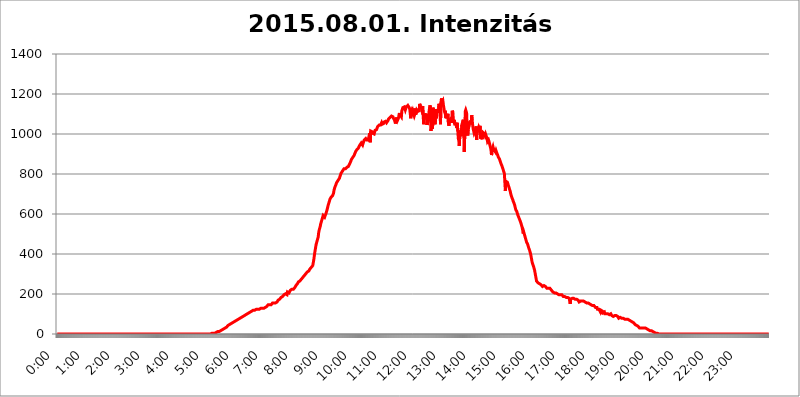
| Category | 2015.08.01. Intenzitás [W/m^2] |
|---|---|
| 0.0 | 0 |
| 0.0006944444444444445 | 0 |
| 0.001388888888888889 | 0 |
| 0.0020833333333333333 | 0 |
| 0.002777777777777778 | 0 |
| 0.003472222222222222 | 0 |
| 0.004166666666666667 | 0 |
| 0.004861111111111111 | 0 |
| 0.005555555555555556 | 0 |
| 0.0062499999999999995 | 0 |
| 0.006944444444444444 | 0 |
| 0.007638888888888889 | 0 |
| 0.008333333333333333 | 0 |
| 0.009027777777777779 | 0 |
| 0.009722222222222222 | 0 |
| 0.010416666666666666 | 0 |
| 0.011111111111111112 | 0 |
| 0.011805555555555555 | 0 |
| 0.012499999999999999 | 0 |
| 0.013194444444444444 | 0 |
| 0.013888888888888888 | 0 |
| 0.014583333333333332 | 0 |
| 0.015277777777777777 | 0 |
| 0.015972222222222224 | 0 |
| 0.016666666666666666 | 0 |
| 0.017361111111111112 | 0 |
| 0.018055555555555557 | 0 |
| 0.01875 | 0 |
| 0.019444444444444445 | 0 |
| 0.02013888888888889 | 0 |
| 0.020833333333333332 | 0 |
| 0.02152777777777778 | 0 |
| 0.022222222222222223 | 0 |
| 0.02291666666666667 | 0 |
| 0.02361111111111111 | 0 |
| 0.024305555555555556 | 0 |
| 0.024999999999999998 | 0 |
| 0.025694444444444447 | 0 |
| 0.02638888888888889 | 0 |
| 0.027083333333333334 | 0 |
| 0.027777777777777776 | 0 |
| 0.02847222222222222 | 0 |
| 0.029166666666666664 | 0 |
| 0.029861111111111113 | 0 |
| 0.030555555555555555 | 0 |
| 0.03125 | 0 |
| 0.03194444444444445 | 0 |
| 0.03263888888888889 | 0 |
| 0.03333333333333333 | 0 |
| 0.034027777777777775 | 0 |
| 0.034722222222222224 | 0 |
| 0.035416666666666666 | 0 |
| 0.036111111111111115 | 0 |
| 0.03680555555555556 | 0 |
| 0.0375 | 0 |
| 0.03819444444444444 | 0 |
| 0.03888888888888889 | 0 |
| 0.03958333333333333 | 0 |
| 0.04027777777777778 | 0 |
| 0.04097222222222222 | 0 |
| 0.041666666666666664 | 0 |
| 0.042361111111111106 | 0 |
| 0.04305555555555556 | 0 |
| 0.043750000000000004 | 0 |
| 0.044444444444444446 | 0 |
| 0.04513888888888889 | 0 |
| 0.04583333333333334 | 0 |
| 0.04652777777777778 | 0 |
| 0.04722222222222222 | 0 |
| 0.04791666666666666 | 0 |
| 0.04861111111111111 | 0 |
| 0.049305555555555554 | 0 |
| 0.049999999999999996 | 0 |
| 0.05069444444444445 | 0 |
| 0.051388888888888894 | 0 |
| 0.052083333333333336 | 0 |
| 0.05277777777777778 | 0 |
| 0.05347222222222222 | 0 |
| 0.05416666666666667 | 0 |
| 0.05486111111111111 | 0 |
| 0.05555555555555555 | 0 |
| 0.05625 | 0 |
| 0.05694444444444444 | 0 |
| 0.057638888888888885 | 0 |
| 0.05833333333333333 | 0 |
| 0.05902777777777778 | 0 |
| 0.059722222222222225 | 0 |
| 0.06041666666666667 | 0 |
| 0.061111111111111116 | 0 |
| 0.06180555555555556 | 0 |
| 0.0625 | 0 |
| 0.06319444444444444 | 0 |
| 0.06388888888888888 | 0 |
| 0.06458333333333334 | 0 |
| 0.06527777777777778 | 0 |
| 0.06597222222222222 | 0 |
| 0.06666666666666667 | 0 |
| 0.06736111111111111 | 0 |
| 0.06805555555555555 | 0 |
| 0.06874999999999999 | 0 |
| 0.06944444444444443 | 0 |
| 0.07013888888888889 | 0 |
| 0.07083333333333333 | 0 |
| 0.07152777777777779 | 0 |
| 0.07222222222222223 | 0 |
| 0.07291666666666667 | 0 |
| 0.07361111111111111 | 0 |
| 0.07430555555555556 | 0 |
| 0.075 | 0 |
| 0.07569444444444444 | 0 |
| 0.0763888888888889 | 0 |
| 0.07708333333333334 | 0 |
| 0.07777777777777778 | 0 |
| 0.07847222222222222 | 0 |
| 0.07916666666666666 | 0 |
| 0.0798611111111111 | 0 |
| 0.08055555555555556 | 0 |
| 0.08125 | 0 |
| 0.08194444444444444 | 0 |
| 0.08263888888888889 | 0 |
| 0.08333333333333333 | 0 |
| 0.08402777777777777 | 0 |
| 0.08472222222222221 | 0 |
| 0.08541666666666665 | 0 |
| 0.08611111111111112 | 0 |
| 0.08680555555555557 | 0 |
| 0.08750000000000001 | 0 |
| 0.08819444444444445 | 0 |
| 0.08888888888888889 | 0 |
| 0.08958333333333333 | 0 |
| 0.09027777777777778 | 0 |
| 0.09097222222222222 | 0 |
| 0.09166666666666667 | 0 |
| 0.09236111111111112 | 0 |
| 0.09305555555555556 | 0 |
| 0.09375 | 0 |
| 0.09444444444444444 | 0 |
| 0.09513888888888888 | 0 |
| 0.09583333333333333 | 0 |
| 0.09652777777777777 | 0 |
| 0.09722222222222222 | 0 |
| 0.09791666666666667 | 0 |
| 0.09861111111111111 | 0 |
| 0.09930555555555555 | 0 |
| 0.09999999999999999 | 0 |
| 0.10069444444444443 | 0 |
| 0.1013888888888889 | 0 |
| 0.10208333333333335 | 0 |
| 0.10277777777777779 | 0 |
| 0.10347222222222223 | 0 |
| 0.10416666666666667 | 0 |
| 0.10486111111111111 | 0 |
| 0.10555555555555556 | 0 |
| 0.10625 | 0 |
| 0.10694444444444444 | 0 |
| 0.1076388888888889 | 0 |
| 0.10833333333333334 | 0 |
| 0.10902777777777778 | 0 |
| 0.10972222222222222 | 0 |
| 0.1111111111111111 | 0 |
| 0.11180555555555556 | 0 |
| 0.11180555555555556 | 0 |
| 0.1125 | 0 |
| 0.11319444444444444 | 0 |
| 0.11388888888888889 | 0 |
| 0.11458333333333333 | 0 |
| 0.11527777777777777 | 0 |
| 0.11597222222222221 | 0 |
| 0.11666666666666665 | 0 |
| 0.1173611111111111 | 0 |
| 0.11805555555555557 | 0 |
| 0.11944444444444445 | 0 |
| 0.12013888888888889 | 0 |
| 0.12083333333333333 | 0 |
| 0.12152777777777778 | 0 |
| 0.12222222222222223 | 0 |
| 0.12291666666666667 | 0 |
| 0.12291666666666667 | 0 |
| 0.12361111111111112 | 0 |
| 0.12430555555555556 | 0 |
| 0.125 | 0 |
| 0.12569444444444444 | 0 |
| 0.12638888888888888 | 0 |
| 0.12708333333333333 | 0 |
| 0.16875 | 0 |
| 0.12847222222222224 | 0 |
| 0.12916666666666668 | 0 |
| 0.12986111111111112 | 0 |
| 0.13055555555555556 | 0 |
| 0.13125 | 0 |
| 0.13194444444444445 | 0 |
| 0.1326388888888889 | 0 |
| 0.13333333333333333 | 0 |
| 0.13402777777777777 | 0 |
| 0.13402777777777777 | 0 |
| 0.13472222222222222 | 0 |
| 0.13541666666666666 | 0 |
| 0.1361111111111111 | 0 |
| 0.13749999999999998 | 0 |
| 0.13819444444444443 | 0 |
| 0.1388888888888889 | 0 |
| 0.13958333333333334 | 0 |
| 0.14027777777777778 | 0 |
| 0.14097222222222222 | 0 |
| 0.14166666666666666 | 0 |
| 0.1423611111111111 | 0 |
| 0.14305555555555557 | 0 |
| 0.14375000000000002 | 0 |
| 0.14444444444444446 | 0 |
| 0.1451388888888889 | 0 |
| 0.1451388888888889 | 0 |
| 0.14652777777777778 | 0 |
| 0.14722222222222223 | 0 |
| 0.14791666666666667 | 0 |
| 0.1486111111111111 | 0 |
| 0.14930555555555555 | 0 |
| 0.15 | 0 |
| 0.15069444444444444 | 0 |
| 0.15138888888888888 | 0 |
| 0.15208333333333332 | 0 |
| 0.15277777777777776 | 0 |
| 0.15347222222222223 | 0 |
| 0.15416666666666667 | 0 |
| 0.15486111111111112 | 0 |
| 0.15555555555555556 | 0 |
| 0.15625 | 0 |
| 0.15694444444444444 | 0 |
| 0.15763888888888888 | 0 |
| 0.15833333333333333 | 0 |
| 0.15902777777777777 | 0 |
| 0.15972222222222224 | 0 |
| 0.16041666666666668 | 0 |
| 0.16111111111111112 | 0 |
| 0.16180555555555556 | 0 |
| 0.1625 | 0 |
| 0.16319444444444445 | 0 |
| 0.1638888888888889 | 0 |
| 0.16458333333333333 | 0 |
| 0.16527777777777777 | 0 |
| 0.16597222222222222 | 0 |
| 0.16666666666666666 | 0 |
| 0.1673611111111111 | 0 |
| 0.16805555555555554 | 0 |
| 0.16874999999999998 | 0 |
| 0.16944444444444443 | 0 |
| 0.17013888888888887 | 0 |
| 0.1708333333333333 | 0 |
| 0.17152777777777775 | 0 |
| 0.17222222222222225 | 0 |
| 0.1729166666666667 | 0 |
| 0.17361111111111113 | 0 |
| 0.17430555555555557 | 0 |
| 0.17500000000000002 | 0 |
| 0.17569444444444446 | 0 |
| 0.1763888888888889 | 0 |
| 0.17708333333333334 | 0 |
| 0.17777777777777778 | 0 |
| 0.17847222222222223 | 0 |
| 0.17916666666666667 | 0 |
| 0.1798611111111111 | 0 |
| 0.18055555555555555 | 0 |
| 0.18125 | 0 |
| 0.18194444444444444 | 0 |
| 0.1826388888888889 | 0 |
| 0.18333333333333335 | 0 |
| 0.1840277777777778 | 0 |
| 0.18472222222222223 | 0 |
| 0.18541666666666667 | 0 |
| 0.18611111111111112 | 0 |
| 0.18680555555555556 | 0 |
| 0.1875 | 0 |
| 0.18819444444444444 | 0 |
| 0.18888888888888888 | 0 |
| 0.18958333333333333 | 0 |
| 0.19027777777777777 | 0 |
| 0.1909722222222222 | 0 |
| 0.19166666666666665 | 0 |
| 0.19236111111111112 | 0 |
| 0.19305555555555554 | 0 |
| 0.19375 | 0 |
| 0.19444444444444445 | 0 |
| 0.1951388888888889 | 0 |
| 0.19583333333333333 | 0 |
| 0.19652777777777777 | 0 |
| 0.19722222222222222 | 0 |
| 0.19791666666666666 | 0 |
| 0.1986111111111111 | 0 |
| 0.19930555555555554 | 0 |
| 0.19999999999999998 | 0 |
| 0.20069444444444443 | 0 |
| 0.20138888888888887 | 0 |
| 0.2020833333333333 | 0 |
| 0.2027777777777778 | 0 |
| 0.2034722222222222 | 0 |
| 0.2041666666666667 | 0 |
| 0.20486111111111113 | 0 |
| 0.20555555555555557 | 0 |
| 0.20625000000000002 | 0 |
| 0.20694444444444446 | 0 |
| 0.2076388888888889 | 0 |
| 0.20833333333333334 | 0 |
| 0.20902777777777778 | 0 |
| 0.20972222222222223 | 0 |
| 0.21041666666666667 | 0 |
| 0.2111111111111111 | 0 |
| 0.21180555555555555 | 0 |
| 0.2125 | 0 |
| 0.21319444444444444 | 0 |
| 0.2138888888888889 | 0 |
| 0.21458333333333335 | 0 |
| 0.2152777777777778 | 0 |
| 0.21597222222222223 | 0 |
| 0.21666666666666667 | 3.525 |
| 0.21736111111111112 | 3.525 |
| 0.21805555555555556 | 3.525 |
| 0.21875 | 3.525 |
| 0.21944444444444444 | 3.525 |
| 0.22013888888888888 | 3.525 |
| 0.22083333333333333 | 3.525 |
| 0.22152777777777777 | 7.887 |
| 0.2222222222222222 | 3.525 |
| 0.22291666666666665 | 7.887 |
| 0.2236111111111111 | 7.887 |
| 0.22430555555555556 | 7.887 |
| 0.225 | 12.257 |
| 0.22569444444444445 | 12.257 |
| 0.2263888888888889 | 12.257 |
| 0.22708333333333333 | 12.257 |
| 0.22777777777777777 | 16.636 |
| 0.22847222222222222 | 16.636 |
| 0.22916666666666666 | 16.636 |
| 0.2298611111111111 | 16.636 |
| 0.23055555555555554 | 21.024 |
| 0.23124999999999998 | 21.024 |
| 0.23194444444444443 | 21.024 |
| 0.23263888888888887 | 21.024 |
| 0.2333333333333333 | 25.419 |
| 0.2340277777777778 | 25.419 |
| 0.2347222222222222 | 25.419 |
| 0.2354166666666667 | 29.823 |
| 0.23611111111111113 | 29.823 |
| 0.23680555555555557 | 34.234 |
| 0.23750000000000002 | 34.234 |
| 0.23819444444444446 | 38.653 |
| 0.2388888888888889 | 38.653 |
| 0.23958333333333334 | 43.079 |
| 0.24027777777777778 | 43.079 |
| 0.24097222222222223 | 47.511 |
| 0.24166666666666667 | 47.511 |
| 0.2423611111111111 | 47.511 |
| 0.24305555555555555 | 47.511 |
| 0.24375 | 51.951 |
| 0.24444444444444446 | 51.951 |
| 0.24513888888888888 | 56.398 |
| 0.24583333333333335 | 56.398 |
| 0.2465277777777778 | 56.398 |
| 0.24722222222222223 | 60.85 |
| 0.24791666666666667 | 60.85 |
| 0.24861111111111112 | 65.31 |
| 0.24930555555555556 | 65.31 |
| 0.25 | 65.31 |
| 0.25069444444444444 | 69.775 |
| 0.2513888888888889 | 69.775 |
| 0.2520833333333333 | 69.775 |
| 0.25277777777777777 | 74.246 |
| 0.2534722222222222 | 74.246 |
| 0.25416666666666665 | 74.246 |
| 0.2548611111111111 | 74.246 |
| 0.2555555555555556 | 78.722 |
| 0.25625000000000003 | 78.722 |
| 0.2569444444444445 | 83.205 |
| 0.2576388888888889 | 83.205 |
| 0.25833333333333336 | 83.205 |
| 0.2590277777777778 | 87.692 |
| 0.25972222222222224 | 87.692 |
| 0.2604166666666667 | 87.692 |
| 0.2611111111111111 | 92.184 |
| 0.26180555555555557 | 92.184 |
| 0.2625 | 92.184 |
| 0.26319444444444445 | 96.682 |
| 0.2638888888888889 | 96.682 |
| 0.26458333333333334 | 96.682 |
| 0.2652777777777778 | 101.184 |
| 0.2659722222222222 | 101.184 |
| 0.26666666666666666 | 101.184 |
| 0.2673611111111111 | 101.184 |
| 0.26805555555555555 | 101.184 |
| 0.26875 | 105.69 |
| 0.26944444444444443 | 110.201 |
| 0.2701388888888889 | 110.201 |
| 0.2708333333333333 | 110.201 |
| 0.27152777777777776 | 110.201 |
| 0.2722222222222222 | 110.201 |
| 0.27291666666666664 | 114.716 |
| 0.2736111111111111 | 114.716 |
| 0.2743055555555555 | 114.716 |
| 0.27499999999999997 | 119.235 |
| 0.27569444444444446 | 119.235 |
| 0.27638888888888885 | 119.235 |
| 0.27708333333333335 | 119.235 |
| 0.2777777777777778 | 119.235 |
| 0.27847222222222223 | 119.235 |
| 0.2791666666666667 | 123.758 |
| 0.2798611111111111 | 123.758 |
| 0.28055555555555556 | 123.758 |
| 0.28125 | 123.758 |
| 0.28194444444444444 | 128.284 |
| 0.2826388888888889 | 128.284 |
| 0.2833333333333333 | 123.758 |
| 0.28402777777777777 | 128.284 |
| 0.2847222222222222 | 123.758 |
| 0.28541666666666665 | 128.284 |
| 0.28611111111111115 | 128.284 |
| 0.28680555555555554 | 128.284 |
| 0.28750000000000003 | 128.284 |
| 0.2881944444444445 | 128.284 |
| 0.2888888888888889 | 128.284 |
| 0.28958333333333336 | 128.284 |
| 0.2902777777777778 | 128.284 |
| 0.29097222222222224 | 123.758 |
| 0.2916666666666667 | 132.814 |
| 0.2923611111111111 | 132.814 |
| 0.29305555555555557 | 137.347 |
| 0.29375 | 137.347 |
| 0.29444444444444445 | 137.347 |
| 0.2951388888888889 | 141.884 |
| 0.29583333333333334 | 146.423 |
| 0.2965277777777778 | 141.884 |
| 0.2972222222222222 | 141.884 |
| 0.29791666666666666 | 146.423 |
| 0.2986111111111111 | 141.884 |
| 0.29930555555555555 | 146.423 |
| 0.3 | 146.423 |
| 0.30069444444444443 | 150.964 |
| 0.3013888888888889 | 150.964 |
| 0.3020833333333333 | 155.509 |
| 0.30277777777777776 | 155.509 |
| 0.3034722222222222 | 155.509 |
| 0.30416666666666664 | 155.509 |
| 0.3048611111111111 | 155.509 |
| 0.3055555555555555 | 155.509 |
| 0.30624999999999997 | 155.509 |
| 0.3069444444444444 | 160.056 |
| 0.3076388888888889 | 160.056 |
| 0.30833333333333335 | 160.056 |
| 0.3090277777777778 | 164.605 |
| 0.30972222222222223 | 169.156 |
| 0.3104166666666667 | 169.156 |
| 0.3111111111111111 | 173.709 |
| 0.31180555555555556 | 173.709 |
| 0.3125 | 173.709 |
| 0.31319444444444444 | 178.264 |
| 0.3138888888888889 | 182.82 |
| 0.3145833333333333 | 182.82 |
| 0.31527777777777777 | 187.378 |
| 0.3159722222222222 | 187.378 |
| 0.31666666666666665 | 191.937 |
| 0.31736111111111115 | 191.937 |
| 0.31805555555555554 | 196.497 |
| 0.31875000000000003 | 201.058 |
| 0.3194444444444445 | 201.058 |
| 0.3201388888888889 | 201.058 |
| 0.32083333333333336 | 201.058 |
| 0.3215277777777778 | 205.62 |
| 0.32222222222222224 | 196.497 |
| 0.3229166666666667 | 210.182 |
| 0.3236111111111111 | 210.182 |
| 0.32430555555555557 | 205.62 |
| 0.325 | 205.62 |
| 0.32569444444444445 | 210.182 |
| 0.3263888888888889 | 210.182 |
| 0.32708333333333334 | 219.309 |
| 0.3277777777777778 | 219.309 |
| 0.3284722222222222 | 219.309 |
| 0.32916666666666666 | 223.873 |
| 0.3298611111111111 | 219.309 |
| 0.33055555555555555 | 223.873 |
| 0.33125 | 223.873 |
| 0.33194444444444443 | 223.873 |
| 0.3326388888888889 | 228.436 |
| 0.3333333333333333 | 233 |
| 0.3340277777777778 | 237.564 |
| 0.3347222222222222 | 242.127 |
| 0.3354166666666667 | 242.127 |
| 0.3361111111111111 | 246.689 |
| 0.3368055555555556 | 251.251 |
| 0.33749999999999997 | 251.251 |
| 0.33819444444444446 | 260.373 |
| 0.33888888888888885 | 260.373 |
| 0.33958333333333335 | 264.932 |
| 0.34027777777777773 | 264.932 |
| 0.34097222222222223 | 269.49 |
| 0.3416666666666666 | 269.49 |
| 0.3423611111111111 | 274.047 |
| 0.3430555555555555 | 278.603 |
| 0.34375 | 278.603 |
| 0.3444444444444445 | 283.156 |
| 0.3451388888888889 | 287.709 |
| 0.3458333333333334 | 287.709 |
| 0.34652777777777777 | 292.259 |
| 0.34722222222222227 | 296.808 |
| 0.34791666666666665 | 296.808 |
| 0.34861111111111115 | 301.354 |
| 0.34930555555555554 | 301.354 |
| 0.35000000000000003 | 305.898 |
| 0.3506944444444444 | 310.44 |
| 0.3513888888888889 | 310.44 |
| 0.3520833333333333 | 314.98 |
| 0.3527777777777778 | 314.98 |
| 0.3534722222222222 | 319.517 |
| 0.3541666666666667 | 324.052 |
| 0.3548611111111111 | 324.052 |
| 0.35555555555555557 | 328.584 |
| 0.35625 | 333.113 |
| 0.35694444444444445 | 333.113 |
| 0.3576388888888889 | 337.639 |
| 0.35833333333333334 | 342.162 |
| 0.3590277777777778 | 355.712 |
| 0.3597222222222222 | 369.23 |
| 0.36041666666666666 | 387.202 |
| 0.3611111111111111 | 405.108 |
| 0.36180555555555555 | 405.108 |
| 0.3625 | 436.27 |
| 0.36319444444444443 | 449.551 |
| 0.3638888888888889 | 458.38 |
| 0.3645833333333333 | 467.187 |
| 0.3652777777777778 | 475.972 |
| 0.3659722222222222 | 484.735 |
| 0.3666666666666667 | 506.542 |
| 0.3673611111111111 | 519.555 |
| 0.3680555555555556 | 528.2 |
| 0.36874999999999997 | 536.82 |
| 0.36944444444444446 | 549.704 |
| 0.37013888888888885 | 558.261 |
| 0.37083333333333335 | 566.793 |
| 0.37152777777777773 | 575.299 |
| 0.37222222222222223 | 583.779 |
| 0.3729166666666666 | 592.233 |
| 0.3736111111111111 | 592.233 |
| 0.3743055555555555 | 588.009 |
| 0.375 | 583.779 |
| 0.3756944444444445 | 579.542 |
| 0.3763888888888889 | 583.779 |
| 0.3770833333333334 | 604.864 |
| 0.37777777777777777 | 613.252 |
| 0.37847222222222227 | 621.613 |
| 0.37916666666666665 | 625.784 |
| 0.37986111111111115 | 642.4 |
| 0.38055555555555554 | 642.4 |
| 0.38125000000000003 | 658.909 |
| 0.3819444444444444 | 667.123 |
| 0.3826388888888889 | 675.311 |
| 0.3833333333333333 | 679.395 |
| 0.3840277777777778 | 683.473 |
| 0.3847222222222222 | 683.473 |
| 0.3854166666666667 | 687.544 |
| 0.3861111111111111 | 691.608 |
| 0.38680555555555557 | 695.666 |
| 0.3875 | 703.762 |
| 0.38819444444444445 | 719.877 |
| 0.3888888888888889 | 727.896 |
| 0.38958333333333334 | 735.89 |
| 0.3902777777777778 | 739.877 |
| 0.3909722222222222 | 747.834 |
| 0.39166666666666666 | 755.766 |
| 0.3923611111111111 | 759.723 |
| 0.39305555555555555 | 763.674 |
| 0.39375 | 767.62 |
| 0.39444444444444443 | 771.559 |
| 0.3951388888888889 | 775.492 |
| 0.3958333333333333 | 779.42 |
| 0.3965277777777778 | 787.258 |
| 0.3972222222222222 | 795.074 |
| 0.3979166666666667 | 802.868 |
| 0.3986111111111111 | 806.757 |
| 0.3993055555555556 | 810.641 |
| 0.39999999999999997 | 814.519 |
| 0.40069444444444446 | 818.392 |
| 0.40138888888888885 | 822.26 |
| 0.40208333333333335 | 826.123 |
| 0.40277777777777773 | 826.123 |
| 0.40347222222222223 | 822.26 |
| 0.4041666666666666 | 826.123 |
| 0.4048611111111111 | 829.981 |
| 0.4055555555555555 | 822.26 |
| 0.40625 | 833.834 |
| 0.4069444444444445 | 837.682 |
| 0.4076388888888889 | 833.834 |
| 0.4083333333333334 | 837.682 |
| 0.40902777777777777 | 841.526 |
| 0.40972222222222227 | 837.682 |
| 0.41041666666666665 | 853.029 |
| 0.41111111111111115 | 853.029 |
| 0.41180555555555554 | 864.493 |
| 0.41250000000000003 | 872.114 |
| 0.4131944444444444 | 875.918 |
| 0.4138888888888889 | 879.719 |
| 0.4145833333333333 | 883.516 |
| 0.4152777777777778 | 887.309 |
| 0.4159722222222222 | 891.099 |
| 0.4166666666666667 | 894.885 |
| 0.4173611111111111 | 902.447 |
| 0.41805555555555557 | 906.223 |
| 0.41875 | 913.766 |
| 0.41944444444444445 | 917.534 |
| 0.4201388888888889 | 921.298 |
| 0.42083333333333334 | 925.06 |
| 0.4215277777777778 | 925.06 |
| 0.4222222222222222 | 928.819 |
| 0.42291666666666666 | 932.576 |
| 0.4236111111111111 | 940.082 |
| 0.42430555555555555 | 943.832 |
| 0.425 | 947.58 |
| 0.42569444444444443 | 947.58 |
| 0.4263888888888889 | 955.071 |
| 0.4270833333333333 | 955.071 |
| 0.4277777777777778 | 947.58 |
| 0.4284722222222222 | 962.555 |
| 0.4291666666666667 | 955.071 |
| 0.4298611111111111 | 962.555 |
| 0.4305555555555556 | 970.034 |
| 0.43124999999999997 | 970.034 |
| 0.43194444444444446 | 970.034 |
| 0.43263888888888885 | 977.508 |
| 0.43333333333333335 | 981.244 |
| 0.43402777777777773 | 970.034 |
| 0.43472222222222223 | 966.295 |
| 0.4354166666666666 | 973.772 |
| 0.4361111111111111 | 970.034 |
| 0.4368055555555555 | 970.034 |
| 0.4375 | 970.034 |
| 0.4381944444444445 | 1003.65 |
| 0.4388888888888889 | 958.814 |
| 0.4395833333333334 | 1014.852 |
| 0.44027777777777777 | 1011.118 |
| 0.44097222222222227 | 1011.118 |
| 0.44166666666666665 | 1011.118 |
| 0.44236111111111115 | 1003.65 |
| 0.44305555555555554 | 1007.383 |
| 0.44375000000000003 | 1003.65 |
| 0.4444444444444444 | 999.916 |
| 0.4451388888888889 | 1003.65 |
| 0.4458333333333333 | 1018.587 |
| 0.4465277777777778 | 1018.587 |
| 0.4472222222222222 | 1018.587 |
| 0.4479166666666667 | 1022.323 |
| 0.4486111111111111 | 1029.798 |
| 0.44930555555555557 | 1037.277 |
| 0.45 | 1037.277 |
| 0.45069444444444445 | 1041.019 |
| 0.4513888888888889 | 1044.762 |
| 0.45208333333333334 | 1048.508 |
| 0.4527777777777778 | 1044.762 |
| 0.4534722222222222 | 1044.762 |
| 0.45416666666666666 | 1048.508 |
| 0.4548611111111111 | 1056.004 |
| 0.45555555555555555 | 1048.508 |
| 0.45625 | 1048.508 |
| 0.45694444444444443 | 1044.762 |
| 0.4576388888888889 | 1052.255 |
| 0.4583333333333333 | 1059.756 |
| 0.4590277777777778 | 1059.756 |
| 0.4597222222222222 | 1063.51 |
| 0.4604166666666667 | 1063.51 |
| 0.4611111111111111 | 1059.756 |
| 0.4618055555555556 | 1056.004 |
| 0.46249999999999997 | 1056.004 |
| 0.46319444444444446 | 1059.756 |
| 0.46388888888888885 | 1067.267 |
| 0.46458333333333335 | 1074.789 |
| 0.46527777777777773 | 1078.555 |
| 0.46597222222222223 | 1078.555 |
| 0.4666666666666666 | 1082.324 |
| 0.4673611111111111 | 1082.324 |
| 0.4680555555555555 | 1086.097 |
| 0.46875 | 1089.873 |
| 0.4694444444444445 | 1089.873 |
| 0.4701388888888889 | 1086.097 |
| 0.4708333333333334 | 1086.097 |
| 0.47152777777777777 | 1078.555 |
| 0.47222222222222227 | 1078.555 |
| 0.47291666666666665 | 1071.027 |
| 0.47361111111111115 | 1074.789 |
| 0.47430555555555554 | 1052.255 |
| 0.47500000000000003 | 1056.004 |
| 0.4756944444444444 | 1082.324 |
| 0.4763888888888889 | 1078.555 |
| 0.4770833333333333 | 1067.267 |
| 0.4777777777777778 | 1063.51 |
| 0.4784722222222222 | 1078.555 |
| 0.4791666666666667 | 1078.555 |
| 0.4798611111111111 | 1105.019 |
| 0.48055555555555557 | 1097.437 |
| 0.48125 | 1097.437 |
| 0.48194444444444445 | 1101.226 |
| 0.4826388888888889 | 1086.097 |
| 0.48333333333333334 | 1116.426 |
| 0.4840277777777778 | 1120.238 |
| 0.4847222222222222 | 1131.708 |
| 0.48541666666666666 | 1131.708 |
| 0.4861111111111111 | 1131.708 |
| 0.48680555555555555 | 1135.543 |
| 0.4875 | 1131.708 |
| 0.48819444444444443 | 1120.238 |
| 0.4888888888888889 | 1120.238 |
| 0.4895833333333333 | 1135.543 |
| 0.4902777777777778 | 1135.543 |
| 0.4909722222222222 | 1135.543 |
| 0.4916666666666667 | 1143.232 |
| 0.4923611111111111 | 1147.086 |
| 0.4930555555555556 | 1143.232 |
| 0.49374999999999997 | 1131.708 |
| 0.49444444444444446 | 1124.056 |
| 0.49513888888888885 | 1101.226 |
| 0.49583333333333335 | 1078.555 |
| 0.49652777777777773 | 1108.816 |
| 0.49722222222222223 | 1116.426 |
| 0.4979166666666666 | 1108.816 |
| 0.4986111111111111 | 1116.426 |
| 0.4993055555555555 | 1112.618 |
| 0.5 | 1097.437 |
| 0.5006944444444444 | 1089.873 |
| 0.5013888888888889 | 1097.437 |
| 0.5020833333333333 | 1127.879 |
| 0.5027777777777778 | 1097.437 |
| 0.5034722222222222 | 1101.226 |
| 0.5041666666666667 | 1120.238 |
| 0.5048611111111111 | 1124.056 |
| 0.5055555555555555 | 1112.618 |
| 0.50625 | 1108.816 |
| 0.5069444444444444 | 1116.426 |
| 0.5076388888888889 | 1116.426 |
| 0.5083333333333333 | 1150.946 |
| 0.5090277777777777 | 1143.232 |
| 0.5097222222222222 | 1147.086 |
| 0.5104166666666666 | 1135.543 |
| 0.5111111111111112 | 1124.056 |
| 0.5118055555555555 | 1120.238 |
| 0.5125000000000001 | 1139.384 |
| 0.5131944444444444 | 1093.653 |
| 0.513888888888889 | 1048.508 |
| 0.5145833333333333 | 1101.226 |
| 0.5152777777777778 | 1089.873 |
| 0.5159722222222222 | 1101.226 |
| 0.5166666666666667 | 1097.437 |
| 0.517361111111111 | 1082.324 |
| 0.5180555555555556 | 1101.226 |
| 0.5187499999999999 | 1044.762 |
| 0.5194444444444445 | 1071.027 |
| 0.5201388888888888 | 1063.51 |
| 0.5208333333333334 | 1082.324 |
| 0.5215277777777778 | 1112.618 |
| 0.5222222222222223 | 1131.708 |
| 0.5229166666666667 | 1143.232 |
| 0.5236111111111111 | 1116.426 |
| 0.5243055555555556 | 1014.852 |
| 0.525 | 1108.816 |
| 0.5256944444444445 | 1056.004 |
| 0.5263888888888889 | 1026.06 |
| 0.5270833333333333 | 1131.708 |
| 0.5277777777777778 | 1135.543 |
| 0.5284722222222222 | 1086.097 |
| 0.5291666666666667 | 1124.056 |
| 0.5298611111111111 | 1048.508 |
| 0.5305555555555556 | 1112.618 |
| 0.53125 | 1124.056 |
| 0.5319444444444444 | 1078.555 |
| 0.5326388888888889 | 1124.056 |
| 0.5333333333333333 | 1116.426 |
| 0.5340277777777778 | 1124.056 |
| 0.5347222222222222 | 1105.019 |
| 0.5354166666666667 | 1150.946 |
| 0.5361111111111111 | 1154.814 |
| 0.5368055555555555 | 1131.708 |
| 0.5375 | 1048.508 |
| 0.5381944444444444 | 1158.689 |
| 0.5388888888888889 | 1178.177 |
| 0.5395833333333333 | 1150.946 |
| 0.5402777777777777 | 1150.946 |
| 0.5409722222222222 | 1162.571 |
| 0.5416666666666666 | 1143.232 |
| 0.5423611111111112 | 1127.879 |
| 0.5430555555555555 | 1112.618 |
| 0.5437500000000001 | 1105.019 |
| 0.5444444444444444 | 1116.426 |
| 0.545138888888889 | 1078.555 |
| 0.5458333333333333 | 1093.653 |
| 0.5465277777777778 | 1097.437 |
| 0.5472222222222222 | 1086.097 |
| 0.5479166666666667 | 1101.226 |
| 0.548611111111111 | 1056.004 |
| 0.5493055555555556 | 1041.019 |
| 0.5499999999999999 | 1067.267 |
| 0.5506944444444445 | 1074.789 |
| 0.5513888888888888 | 1059.756 |
| 0.5520833333333334 | 1074.789 |
| 0.5527777777777778 | 1082.324 |
| 0.5534722222222223 | 1056.004 |
| 0.5541666666666667 | 1116.426 |
| 0.5548611111111111 | 1108.816 |
| 0.5555555555555556 | 1071.027 |
| 0.55625 | 1063.51 |
| 0.5569444444444445 | 1071.027 |
| 0.5576388888888889 | 1052.255 |
| 0.5583333333333333 | 1048.508 |
| 0.5590277777777778 | 1048.508 |
| 0.5597222222222222 | 1041.019 |
| 0.5604166666666667 | 1029.798 |
| 0.5611111111111111 | 1056.004 |
| 0.5618055555555556 | 1014.852 |
| 0.5625 | 977.508 |
| 0.5631944444444444 | 966.295 |
| 0.5638888888888889 | 940.082 |
| 0.5645833333333333 | 992.448 |
| 0.5652777777777778 | 1018.587 |
| 0.5659722222222222 | 1007.383 |
| 0.5666666666666667 | 988.714 |
| 0.5673611111111111 | 1044.762 |
| 0.5680555555555555 | 1041.019 |
| 0.56875 | 1044.762 |
| 0.5694444444444444 | 1071.027 |
| 0.5701388888888889 | 1003.65 |
| 0.5708333333333333 | 909.996 |
| 0.5715277777777777 | 996.182 |
| 0.5722222222222222 | 1112.618 |
| 0.5729166666666666 | 1120.238 |
| 0.5736111111111112 | 1112.618 |
| 0.5743055555555555 | 1101.226 |
| 0.5750000000000001 | 1007.383 |
| 0.5756944444444444 | 992.448 |
| 0.576388888888889 | 1022.323 |
| 0.5770833333333333 | 1033.537 |
| 0.5777777777777778 | 1041.019 |
| 0.5784722222222222 | 1063.51 |
| 0.5791666666666667 | 1048.508 |
| 0.579861111111111 | 1067.267 |
| 0.5805555555555556 | 1052.255 |
| 0.5812499999999999 | 1093.653 |
| 0.5819444444444445 | 1071.027 |
| 0.5826388888888888 | 1044.762 |
| 0.5833333333333334 | 1026.06 |
| 0.5840277777777778 | 1026.06 |
| 0.5847222222222223 | 1003.65 |
| 0.5854166666666667 | 1003.65 |
| 0.5861111111111111 | 1014.852 |
| 0.5868055555555556 | 999.916 |
| 0.5875 | 1037.277 |
| 0.5881944444444445 | 970.034 |
| 0.5888888888888889 | 1018.587 |
| 0.5895833333333333 | 1033.537 |
| 0.5902777777777778 | 1026.06 |
| 0.5909722222222222 | 1033.537 |
| 0.5916666666666667 | 1026.06 |
| 0.5923611111111111 | 1026.06 |
| 0.5930555555555556 | 1041.019 |
| 0.59375 | 977.508 |
| 0.5944444444444444 | 999.916 |
| 0.5951388888888889 | 999.916 |
| 0.5958333333333333 | 973.772 |
| 0.5965277777777778 | 996.182 |
| 0.5972222222222222 | 1007.383 |
| 0.5979166666666667 | 1011.118 |
| 0.5986111111111111 | 1007.383 |
| 0.5993055555555555 | 999.916 |
| 0.6 | 992.448 |
| 0.6006944444444444 | 999.916 |
| 0.6013888888888889 | 992.448 |
| 0.6020833333333333 | 996.182 |
| 0.6027777777777777 | 977.508 |
| 0.6034722222222222 | 962.555 |
| 0.6041666666666666 | 966.295 |
| 0.6048611111111112 | 970.034 |
| 0.6055555555555555 | 962.555 |
| 0.6062500000000001 | 966.295 |
| 0.6069444444444444 | 966.295 |
| 0.607638888888889 | 932.576 |
| 0.6083333333333333 | 921.298 |
| 0.6090277777777778 | 894.885 |
| 0.6097222222222222 | 902.447 |
| 0.6104166666666667 | 928.819 |
| 0.611111111111111 | 936.33 |
| 0.6118055555555556 | 925.06 |
| 0.6124999999999999 | 909.996 |
| 0.6131944444444445 | 917.534 |
| 0.6138888888888888 | 913.766 |
| 0.6145833333333334 | 909.996 |
| 0.6152777777777778 | 917.534 |
| 0.6159722222222223 | 909.996 |
| 0.6166666666666667 | 909.996 |
| 0.6173611111111111 | 906.223 |
| 0.6180555555555556 | 891.099 |
| 0.61875 | 883.516 |
| 0.6194444444444445 | 883.516 |
| 0.6201388888888889 | 875.918 |
| 0.6208333333333333 | 868.305 |
| 0.6215277777777778 | 860.676 |
| 0.6222222222222222 | 853.029 |
| 0.6229166666666667 | 849.199 |
| 0.6236111111111111 | 841.526 |
| 0.6243055555555556 | 833.834 |
| 0.625 | 826.123 |
| 0.6256944444444444 | 818.392 |
| 0.6263888888888889 | 810.641 |
| 0.6270833333333333 | 802.868 |
| 0.6277777777777778 | 798.974 |
| 0.6284722222222222 | 715.858 |
| 0.6291666666666667 | 763.674 |
| 0.6298611111111111 | 767.62 |
| 0.6305555555555555 | 767.62 |
| 0.63125 | 759.723 |
| 0.6319444444444444 | 751.803 |
| 0.6326388888888889 | 743.859 |
| 0.6333333333333333 | 735.89 |
| 0.6340277777777777 | 727.896 |
| 0.6347222222222222 | 719.877 |
| 0.6354166666666666 | 711.832 |
| 0.6361111111111112 | 699.717 |
| 0.6368055555555555 | 695.666 |
| 0.6375000000000001 | 683.473 |
| 0.6381944444444444 | 679.395 |
| 0.638888888888889 | 671.22 |
| 0.6395833333333333 | 663.019 |
| 0.6402777777777778 | 658.909 |
| 0.6409722222222222 | 650.667 |
| 0.6416666666666667 | 642.4 |
| 0.642361111111111 | 638.256 |
| 0.6430555555555556 | 621.613 |
| 0.6437499999999999 | 621.613 |
| 0.6444444444444445 | 613.252 |
| 0.6451388888888888 | 604.864 |
| 0.6458333333333334 | 596.45 |
| 0.6465277777777778 | 592.233 |
| 0.6472222222222223 | 583.779 |
| 0.6479166666666667 | 579.542 |
| 0.6486111111111111 | 571.049 |
| 0.6493055555555556 | 566.793 |
| 0.65 | 558.261 |
| 0.6506944444444445 | 549.704 |
| 0.6513888888888889 | 541.121 |
| 0.6520833333333333 | 532.513 |
| 0.6527777777777778 | 519.555 |
| 0.6534722222222222 | 502.192 |
| 0.6541666666666667 | 510.885 |
| 0.6548611111111111 | 502.192 |
| 0.6555555555555556 | 497.836 |
| 0.65625 | 484.735 |
| 0.6569444444444444 | 480.356 |
| 0.6576388888888889 | 467.187 |
| 0.6583333333333333 | 458.38 |
| 0.6590277777777778 | 453.968 |
| 0.6597222222222222 | 449.551 |
| 0.6604166666666667 | 440.702 |
| 0.6611111111111111 | 431.833 |
| 0.6618055555555555 | 427.39 |
| 0.6625 | 418.492 |
| 0.6631944444444444 | 409.574 |
| 0.6638888888888889 | 400.638 |
| 0.6645833333333333 | 387.202 |
| 0.6652777777777777 | 373.729 |
| 0.6659722222222222 | 360.221 |
| 0.6666666666666666 | 351.198 |
| 0.6673611111111111 | 346.682 |
| 0.6680555555555556 | 337.639 |
| 0.6687500000000001 | 328.584 |
| 0.6694444444444444 | 319.517 |
| 0.6701388888888888 | 305.898 |
| 0.6708333333333334 | 292.259 |
| 0.6715277777777778 | 278.603 |
| 0.6722222222222222 | 264.932 |
| 0.6729166666666666 | 260.373 |
| 0.6736111111111112 | 260.373 |
| 0.6743055555555556 | 255.813 |
| 0.6749999999999999 | 255.813 |
| 0.6756944444444444 | 251.251 |
| 0.6763888888888889 | 251.251 |
| 0.6770833333333334 | 251.251 |
| 0.6777777777777777 | 246.689 |
| 0.6784722222222223 | 246.689 |
| 0.6791666666666667 | 246.689 |
| 0.6798611111111111 | 242.127 |
| 0.6805555555555555 | 237.564 |
| 0.68125 | 242.127 |
| 0.6819444444444445 | 242.127 |
| 0.6826388888888889 | 242.127 |
| 0.6833333333333332 | 242.127 |
| 0.6840277777777778 | 237.564 |
| 0.6847222222222222 | 237.564 |
| 0.6854166666666667 | 237.564 |
| 0.686111111111111 | 233 |
| 0.6868055555555556 | 228.436 |
| 0.6875 | 233 |
| 0.6881944444444444 | 233 |
| 0.688888888888889 | 228.436 |
| 0.6895833333333333 | 228.436 |
| 0.6902777777777778 | 228.436 |
| 0.6909722222222222 | 228.436 |
| 0.6916666666666668 | 228.436 |
| 0.6923611111111111 | 223.873 |
| 0.6930555555555555 | 219.309 |
| 0.69375 | 219.309 |
| 0.6944444444444445 | 214.746 |
| 0.6951388888888889 | 210.182 |
| 0.6958333333333333 | 205.62 |
| 0.6965277777777777 | 205.62 |
| 0.6972222222222223 | 205.62 |
| 0.6979166666666666 | 205.62 |
| 0.6986111111111111 | 205.62 |
| 0.6993055555555556 | 205.62 |
| 0.7000000000000001 | 201.058 |
| 0.7006944444444444 | 201.058 |
| 0.7013888888888888 | 201.058 |
| 0.7020833333333334 | 201.058 |
| 0.7027777777777778 | 201.058 |
| 0.7034722222222222 | 196.497 |
| 0.7041666666666666 | 196.497 |
| 0.7048611111111112 | 196.497 |
| 0.7055555555555556 | 196.497 |
| 0.7062499999999999 | 191.937 |
| 0.7069444444444444 | 191.937 |
| 0.7076388888888889 | 196.497 |
| 0.7083333333333334 | 191.937 |
| 0.7090277777777777 | 191.937 |
| 0.7097222222222223 | 187.378 |
| 0.7104166666666667 | 182.82 |
| 0.7111111111111111 | 187.378 |
| 0.7118055555555555 | 187.378 |
| 0.7125 | 182.82 |
| 0.7131944444444445 | 182.82 |
| 0.7138888888888889 | 182.82 |
| 0.7145833333333332 | 187.378 |
| 0.7152777777777778 | 182.82 |
| 0.7159722222222222 | 182.82 |
| 0.7166666666666667 | 178.264 |
| 0.717361111111111 | 182.82 |
| 0.7180555555555556 | 178.264 |
| 0.71875 | 178.264 |
| 0.7194444444444444 | 150.964 |
| 0.720138888888889 | 173.709 |
| 0.7208333333333333 | 178.264 |
| 0.7215277777777778 | 173.709 |
| 0.7222222222222222 | 178.264 |
| 0.7229166666666668 | 173.709 |
| 0.7236111111111111 | 173.709 |
| 0.7243055555555555 | 178.264 |
| 0.725 | 178.264 |
| 0.7256944444444445 | 173.709 |
| 0.7263888888888889 | 173.709 |
| 0.7270833333333333 | 173.709 |
| 0.7277777777777777 | 173.709 |
| 0.7284722222222223 | 173.709 |
| 0.7291666666666666 | 169.156 |
| 0.7298611111111111 | 169.156 |
| 0.7305555555555556 | 169.156 |
| 0.7312500000000001 | 164.605 |
| 0.7319444444444444 | 160.056 |
| 0.7326388888888888 | 164.605 |
| 0.7333333333333334 | 164.605 |
| 0.7340277777777778 | 164.605 |
| 0.7347222222222222 | 169.156 |
| 0.7354166666666666 | 164.605 |
| 0.7361111111111112 | 164.605 |
| 0.7368055555555556 | 164.605 |
| 0.7374999999999999 | 164.605 |
| 0.7381944444444444 | 164.605 |
| 0.7388888888888889 | 164.605 |
| 0.7395833333333334 | 160.056 |
| 0.7402777777777777 | 160.056 |
| 0.7409722222222223 | 160.056 |
| 0.7416666666666667 | 155.509 |
| 0.7423611111111111 | 155.509 |
| 0.7430555555555555 | 155.509 |
| 0.74375 | 150.964 |
| 0.7444444444444445 | 155.509 |
| 0.7451388888888889 | 155.509 |
| 0.7458333333333332 | 155.509 |
| 0.7465277777777778 | 150.964 |
| 0.7472222222222222 | 146.423 |
| 0.7479166666666667 | 146.423 |
| 0.748611111111111 | 146.423 |
| 0.7493055555555556 | 146.423 |
| 0.75 | 146.423 |
| 0.7506944444444444 | 141.884 |
| 0.751388888888889 | 141.884 |
| 0.7520833333333333 | 146.423 |
| 0.7527777777777778 | 141.884 |
| 0.7534722222222222 | 141.884 |
| 0.7541666666666668 | 137.347 |
| 0.7548611111111111 | 132.814 |
| 0.7555555555555555 | 132.814 |
| 0.75625 | 132.814 |
| 0.7569444444444445 | 132.814 |
| 0.7576388888888889 | 123.758 |
| 0.7583333333333333 | 123.758 |
| 0.7590277777777777 | 119.235 |
| 0.7597222222222223 | 123.758 |
| 0.7604166666666666 | 123.758 |
| 0.7611111111111111 | 119.235 |
| 0.7618055555555556 | 110.201 |
| 0.7625000000000001 | 119.235 |
| 0.7631944444444444 | 114.716 |
| 0.7638888888888888 | 114.716 |
| 0.7645833333333334 | 114.716 |
| 0.7652777777777778 | 105.69 |
| 0.7659722222222222 | 105.69 |
| 0.7666666666666666 | 105.69 |
| 0.7673611111111112 | 110.201 |
| 0.7680555555555556 | 101.184 |
| 0.7687499999999999 | 101.184 |
| 0.7694444444444444 | 101.184 |
| 0.7701388888888889 | 101.184 |
| 0.7708333333333334 | 101.184 |
| 0.7715277777777777 | 101.184 |
| 0.7722222222222223 | 101.184 |
| 0.7729166666666667 | 96.682 |
| 0.7736111111111111 | 96.682 |
| 0.7743055555555555 | 96.682 |
| 0.775 | 96.682 |
| 0.7756944444444445 | 101.184 |
| 0.7763888888888889 | 101.184 |
| 0.7770833333333332 | 96.682 |
| 0.7777777777777778 | 92.184 |
| 0.7784722222222222 | 96.682 |
| 0.7791666666666667 | 96.682 |
| 0.779861111111111 | 87.692 |
| 0.7805555555555556 | 92.184 |
| 0.78125 | 92.184 |
| 0.7819444444444444 | 92.184 |
| 0.782638888888889 | 92.184 |
| 0.7833333333333333 | 92.184 |
| 0.7840277777777778 | 92.184 |
| 0.7847222222222222 | 92.184 |
| 0.7854166666666668 | 87.692 |
| 0.7861111111111111 | 87.692 |
| 0.7868055555555555 | 87.692 |
| 0.7875 | 78.722 |
| 0.7881944444444445 | 83.205 |
| 0.7888888888888889 | 83.205 |
| 0.7895833333333333 | 83.205 |
| 0.7902777777777777 | 78.722 |
| 0.7909722222222223 | 78.722 |
| 0.7916666666666666 | 78.722 |
| 0.7923611111111111 | 78.722 |
| 0.7930555555555556 | 83.205 |
| 0.7937500000000001 | 78.722 |
| 0.7944444444444444 | 78.722 |
| 0.7951388888888888 | 78.722 |
| 0.7958333333333334 | 74.246 |
| 0.7965277777777778 | 74.246 |
| 0.7972222222222222 | 74.246 |
| 0.7979166666666666 | 74.246 |
| 0.7986111111111112 | 74.246 |
| 0.7993055555555556 | 74.246 |
| 0.7999999999999999 | 74.246 |
| 0.8006944444444444 | 69.775 |
| 0.8013888888888889 | 69.775 |
| 0.8020833333333334 | 69.775 |
| 0.8027777777777777 | 65.31 |
| 0.8034722222222223 | 65.31 |
| 0.8041666666666667 | 65.31 |
| 0.8048611111111111 | 60.85 |
| 0.8055555555555555 | 60.85 |
| 0.80625 | 60.85 |
| 0.8069444444444445 | 56.398 |
| 0.8076388888888889 | 56.398 |
| 0.8083333333333332 | 56.398 |
| 0.8090277777777778 | 51.951 |
| 0.8097222222222222 | 51.951 |
| 0.8104166666666667 | 47.511 |
| 0.811111111111111 | 47.511 |
| 0.8118055555555556 | 43.079 |
| 0.8125 | 43.079 |
| 0.8131944444444444 | 38.653 |
| 0.813888888888889 | 38.653 |
| 0.8145833333333333 | 38.653 |
| 0.8152777777777778 | 34.234 |
| 0.8159722222222222 | 34.234 |
| 0.8166666666666668 | 29.823 |
| 0.8173611111111111 | 29.823 |
| 0.8180555555555555 | 29.823 |
| 0.81875 | 29.823 |
| 0.8194444444444445 | 29.823 |
| 0.8201388888888889 | 25.419 |
| 0.8208333333333333 | 29.823 |
| 0.8215277777777777 | 29.823 |
| 0.8222222222222223 | 29.823 |
| 0.8229166666666666 | 29.823 |
| 0.8236111111111111 | 29.823 |
| 0.8243055555555556 | 29.823 |
| 0.8250000000000001 | 29.823 |
| 0.8256944444444444 | 29.823 |
| 0.8263888888888888 | 25.419 |
| 0.8270833333333334 | 25.419 |
| 0.8277777777777778 | 25.419 |
| 0.8284722222222222 | 25.419 |
| 0.8291666666666666 | 21.024 |
| 0.8298611111111112 | 21.024 |
| 0.8305555555555556 | 21.024 |
| 0.8312499999999999 | 16.636 |
| 0.8319444444444444 | 16.636 |
| 0.8326388888888889 | 16.636 |
| 0.8333333333333334 | 16.636 |
| 0.8340277777777777 | 12.257 |
| 0.8347222222222223 | 12.257 |
| 0.8354166666666667 | 12.257 |
| 0.8361111111111111 | 7.887 |
| 0.8368055555555555 | 7.887 |
| 0.8375 | 7.887 |
| 0.8381944444444445 | 7.887 |
| 0.8388888888888889 | 3.525 |
| 0.8395833333333332 | 3.525 |
| 0.8402777777777778 | 3.525 |
| 0.8409722222222222 | 3.525 |
| 0.8416666666666667 | 3.525 |
| 0.842361111111111 | 3.525 |
| 0.8430555555555556 | 0 |
| 0.84375 | 0 |
| 0.8444444444444444 | 0 |
| 0.845138888888889 | 0 |
| 0.8458333333333333 | 0 |
| 0.8465277777777778 | 0 |
| 0.8472222222222222 | 0 |
| 0.8479166666666668 | 0 |
| 0.8486111111111111 | 0 |
| 0.8493055555555555 | 0 |
| 0.85 | 0 |
| 0.8506944444444445 | 0 |
| 0.8513888888888889 | 0 |
| 0.8520833333333333 | 0 |
| 0.8527777777777777 | 0 |
| 0.8534722222222223 | 0 |
| 0.8541666666666666 | 0 |
| 0.8548611111111111 | 0 |
| 0.8555555555555556 | 0 |
| 0.8562500000000001 | 0 |
| 0.8569444444444444 | 0 |
| 0.8576388888888888 | 0 |
| 0.8583333333333334 | 0 |
| 0.8590277777777778 | 0 |
| 0.8597222222222222 | 0 |
| 0.8604166666666666 | 0 |
| 0.8611111111111112 | 0 |
| 0.8618055555555556 | 0 |
| 0.8624999999999999 | 0 |
| 0.8631944444444444 | 0 |
| 0.8638888888888889 | 0 |
| 0.8645833333333334 | 0 |
| 0.8652777777777777 | 0 |
| 0.8659722222222223 | 0 |
| 0.8666666666666667 | 0 |
| 0.8673611111111111 | 0 |
| 0.8680555555555555 | 0 |
| 0.86875 | 0 |
| 0.8694444444444445 | 0 |
| 0.8701388888888889 | 0 |
| 0.8708333333333332 | 0 |
| 0.8715277777777778 | 0 |
| 0.8722222222222222 | 0 |
| 0.8729166666666667 | 0 |
| 0.873611111111111 | 0 |
| 0.8743055555555556 | 0 |
| 0.875 | 0 |
| 0.8756944444444444 | 0 |
| 0.876388888888889 | 0 |
| 0.8770833333333333 | 0 |
| 0.8777777777777778 | 0 |
| 0.8784722222222222 | 0 |
| 0.8791666666666668 | 0 |
| 0.8798611111111111 | 0 |
| 0.8805555555555555 | 0 |
| 0.88125 | 0 |
| 0.8819444444444445 | 0 |
| 0.8826388888888889 | 0 |
| 0.8833333333333333 | 0 |
| 0.8840277777777777 | 0 |
| 0.8847222222222223 | 0 |
| 0.8854166666666666 | 0 |
| 0.8861111111111111 | 0 |
| 0.8868055555555556 | 0 |
| 0.8875000000000001 | 0 |
| 0.8881944444444444 | 0 |
| 0.8888888888888888 | 0 |
| 0.8895833333333334 | 0 |
| 0.8902777777777778 | 0 |
| 0.8909722222222222 | 0 |
| 0.8916666666666666 | 0 |
| 0.8923611111111112 | 0 |
| 0.8930555555555556 | 0 |
| 0.8937499999999999 | 0 |
| 0.8944444444444444 | 0 |
| 0.8951388888888889 | 0 |
| 0.8958333333333334 | 0 |
| 0.8965277777777777 | 0 |
| 0.8972222222222223 | 0 |
| 0.8979166666666667 | 0 |
| 0.8986111111111111 | 0 |
| 0.8993055555555555 | 0 |
| 0.9 | 0 |
| 0.9006944444444445 | 0 |
| 0.9013888888888889 | 0 |
| 0.9020833333333332 | 0 |
| 0.9027777777777778 | 0 |
| 0.9034722222222222 | 0 |
| 0.9041666666666667 | 0 |
| 0.904861111111111 | 0 |
| 0.9055555555555556 | 0 |
| 0.90625 | 0 |
| 0.9069444444444444 | 0 |
| 0.907638888888889 | 0 |
| 0.9083333333333333 | 0 |
| 0.9090277777777778 | 0 |
| 0.9097222222222222 | 0 |
| 0.9104166666666668 | 0 |
| 0.9111111111111111 | 0 |
| 0.9118055555555555 | 0 |
| 0.9125 | 0 |
| 0.9131944444444445 | 0 |
| 0.9138888888888889 | 0 |
| 0.9145833333333333 | 0 |
| 0.9152777777777777 | 0 |
| 0.9159722222222223 | 0 |
| 0.9166666666666666 | 0 |
| 0.9173611111111111 | 0 |
| 0.9180555555555556 | 0 |
| 0.9187500000000001 | 0 |
| 0.9194444444444444 | 0 |
| 0.9201388888888888 | 0 |
| 0.9208333333333334 | 0 |
| 0.9215277777777778 | 0 |
| 0.9222222222222222 | 0 |
| 0.9229166666666666 | 0 |
| 0.9236111111111112 | 0 |
| 0.9243055555555556 | 0 |
| 0.9249999999999999 | 0 |
| 0.9256944444444444 | 0 |
| 0.9263888888888889 | 0 |
| 0.9270833333333334 | 0 |
| 0.9277777777777777 | 0 |
| 0.9284722222222223 | 0 |
| 0.9291666666666667 | 0 |
| 0.9298611111111111 | 0 |
| 0.9305555555555555 | 0 |
| 0.93125 | 0 |
| 0.9319444444444445 | 0 |
| 0.9326388888888889 | 0 |
| 0.9333333333333332 | 0 |
| 0.9340277777777778 | 0 |
| 0.9347222222222222 | 0 |
| 0.9354166666666667 | 0 |
| 0.936111111111111 | 0 |
| 0.9368055555555556 | 0 |
| 0.9375 | 0 |
| 0.9381944444444444 | 0 |
| 0.938888888888889 | 0 |
| 0.9395833333333333 | 0 |
| 0.9402777777777778 | 0 |
| 0.9409722222222222 | 0 |
| 0.9416666666666668 | 0 |
| 0.9423611111111111 | 0 |
| 0.9430555555555555 | 0 |
| 0.94375 | 0 |
| 0.9444444444444445 | 0 |
| 0.9451388888888889 | 0 |
| 0.9458333333333333 | 0 |
| 0.9465277777777777 | 0 |
| 0.9472222222222223 | 0 |
| 0.9479166666666666 | 0 |
| 0.9486111111111111 | 0 |
| 0.9493055555555556 | 0 |
| 0.9500000000000001 | 0 |
| 0.9506944444444444 | 0 |
| 0.9513888888888888 | 0 |
| 0.9520833333333334 | 0 |
| 0.9527777777777778 | 0 |
| 0.9534722222222222 | 0 |
| 0.9541666666666666 | 0 |
| 0.9548611111111112 | 0 |
| 0.9555555555555556 | 0 |
| 0.9562499999999999 | 0 |
| 0.9569444444444444 | 0 |
| 0.9576388888888889 | 0 |
| 0.9583333333333334 | 0 |
| 0.9590277777777777 | 0 |
| 0.9597222222222223 | 0 |
| 0.9604166666666667 | 0 |
| 0.9611111111111111 | 0 |
| 0.9618055555555555 | 0 |
| 0.9625 | 0 |
| 0.9631944444444445 | 0 |
| 0.9638888888888889 | 0 |
| 0.9645833333333332 | 0 |
| 0.9652777777777778 | 0 |
| 0.9659722222222222 | 0 |
| 0.9666666666666667 | 0 |
| 0.967361111111111 | 0 |
| 0.9680555555555556 | 0 |
| 0.96875 | 0 |
| 0.9694444444444444 | 0 |
| 0.970138888888889 | 0 |
| 0.9708333333333333 | 0 |
| 0.9715277777777778 | 0 |
| 0.9722222222222222 | 0 |
| 0.9729166666666668 | 0 |
| 0.9736111111111111 | 0 |
| 0.9743055555555555 | 0 |
| 0.975 | 0 |
| 0.9756944444444445 | 0 |
| 0.9763888888888889 | 0 |
| 0.9770833333333333 | 0 |
| 0.9777777777777777 | 0 |
| 0.9784722222222223 | 0 |
| 0.9791666666666666 | 0 |
| 0.9798611111111111 | 0 |
| 0.9805555555555556 | 0 |
| 0.9812500000000001 | 0 |
| 0.9819444444444444 | 0 |
| 0.9826388888888888 | 0 |
| 0.9833333333333334 | 0 |
| 0.9840277777777778 | 0 |
| 0.9847222222222222 | 0 |
| 0.9854166666666666 | 0 |
| 0.9861111111111112 | 0 |
| 0.9868055555555556 | 0 |
| 0.9874999999999999 | 0 |
| 0.9881944444444444 | 0 |
| 0.9888888888888889 | 0 |
| 0.9895833333333334 | 0 |
| 0.9902777777777777 | 0 |
| 0.9909722222222223 | 0 |
| 0.9916666666666667 | 0 |
| 0.9923611111111111 | 0 |
| 0.9930555555555555 | 0 |
| 0.99375 | 0 |
| 0.9944444444444445 | 0 |
| 0.9951388888888889 | 0 |
| 0.9958333333333332 | 0 |
| 0.9965277777777778 | 0 |
| 0.9972222222222222 | 0 |
| 0.9979166666666667 | 0 |
| 0.998611111111111 | 0 |
| 0.9993055555555556 | 0 |